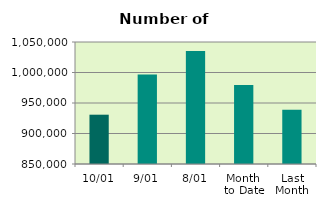
| Category | Series 0 |
|---|---|
| 10/01 | 930824 |
| 9/01 | 996844 |
| 8/01 | 1035204 |
| Month 
to Date | 979407.143 |
| Last
Month | 938735.9 |